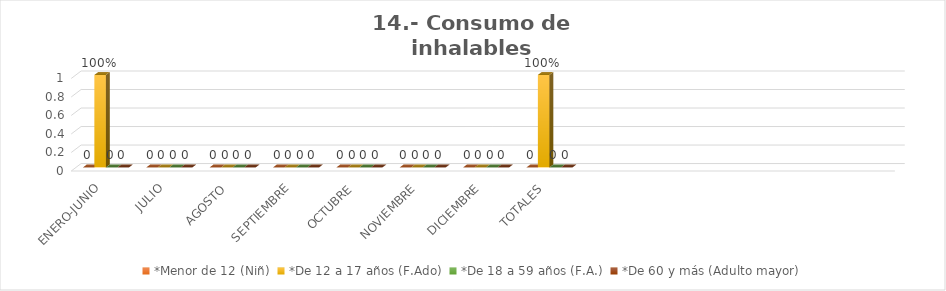
| Category | *Menor de 12 (Niñ) | *De 12 a 17 años (F.Ado) | *De 18 a 59 años (F.A.) | *De 60 y más (Adulto mayor) |
|---|---|---|---|---|
| ENERO-JUNIO | 0 | 1 | 0 | 0 |
| JULIO | 0 | 0 | 0 | 0 |
| AGOSTO | 0 | 0 | 0 | 0 |
| SEPTIEMBRE | 0 | 0 | 0 | 0 |
| OCTUBRE | 0 | 0 | 0 | 0 |
| NOVIEMBRE | 0 | 0 | 0 | 0 |
| DICIEMBRE | 0 | 0 | 0 | 0 |
| TOTALES | 0 | 1 | 0 | 0 |